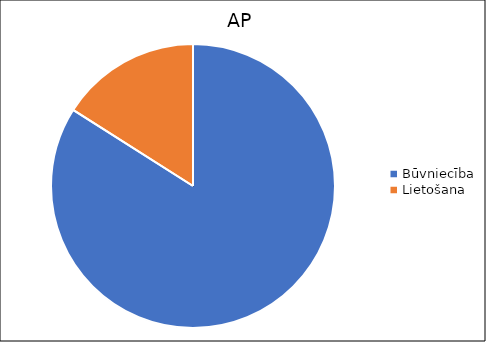
| Category | Būvniecība |
|---|---|
| Būvniecība | 0.021 |
| Lietošana | 0.004 |